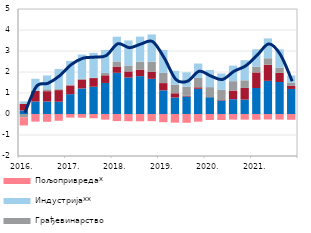
| Category | Остале делатности | Трговина | Грађевинарство | Индустрија** | Пољопривреда* |
|---|---|---|---|---|---|
| 2016. | 0.163 | 0.321 | -0.156 | 0.113 | -0.39 |
| II | 0.595 | 0.508 | 0.015 | 0.558 | -0.363 |
| III | 0.594 | 0.494 | 0.088 | 0.66 | -0.372 |
| IV | 0.585 | 0.553 | 0.046 | 0.96 | -0.322 |
| 2017. | 0.945 | 0.413 | 0.049 | 1.121 | -0.172 |
| II | 1.216 | 0.424 | 0.032 | 1.158 | -0.174 |
| III | 1.297 | 0.414 | 0.02 | 1.182 | -0.205 |
| IV | 1.478 | 0.366 | 0.113 | 1.094 | -0.268 |
| 2018. | 1.962 | 0.298 | 0.242 | 1.18 | -0.338 |
| II | 1.736 | 0.292 | 0.281 | 1.193 | -0.346 |
| III | 1.803 | 0.311 | 0.372 | 1.197 | -0.349 |
| IV | 1.675 | 0.344 | 0.476 | 1.293 | -0.341 |
| 2019. | 1.127 | 0.345 | 0.485 | 1.097 | -0.39 |
| II | 0.785 | 0.202 | 0.402 | 0.668 | -0.414 |
| III | 0.834 | 0.029 | 0.43 | 0.691 | -0.42 |
| IV | 1.2 | 0.072 | 0.444 | 0.687 | -0.366 |
| 2020. | 0.799 | 0.004 | 0.477 | 0.817 | -0.286 |
| II | 0.64 | 0.023 | 0.486 | 0.781 | -0.286 |
| III | 0.703 | 0.414 | 0.446 | 0.741 | -0.267 |
| IV | 0.688 | 0.553 | 0.363 | 0.959 | -0.27 |
| 2021. | 1.237 | 0.743 | 0.271 | 0.829 | -0.274 |
| II | 1.579 | 0.765 | 0.312 | 0.943 | -0.261 |
| III | 1.522 | 0.434 | 0.254 | 0.869 | -0.266 |
| IV | 1.193 | 0.144 | 0.162 | 0.336 | -0.275 |